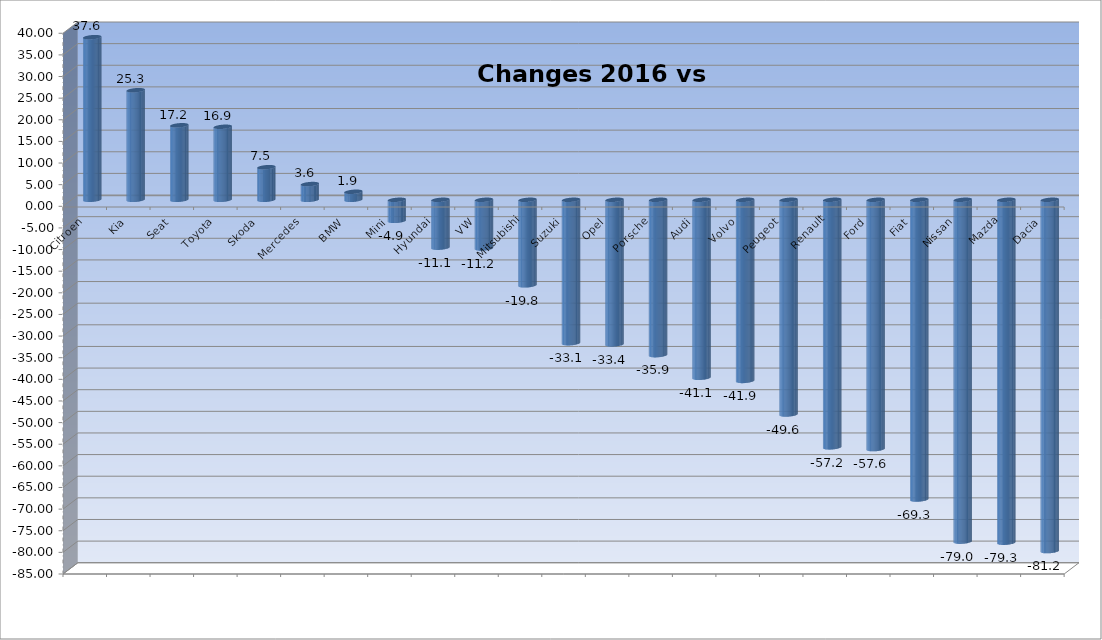
| Category | Ytd 2015 |
|---|---|
| Citroen | 37.594 |
| Kia | 25.331 |
| Seat | 17.226 |
| Toyota | 16.877 |
| Skoda | 7.537 |
| Mercedes | 3.636 |
| BMW | 1.855 |
| Mini | -4.863 |
| Hyundai | -11.07 |
| VW | -11.248 |
| Mitsubishi | -19.771 |
| Suzuki | -33.144 |
| Opel | -33.434 |
| Porsche | -35.915 |
| Audi | -41.139 |
| Volvo | -41.867 |
| Peugeot | -49.633 |
| Renault | -57.232 |
| Ford | -57.625 |
| Fiat | -69.29 |
| Nissan | -79.026 |
| Mazda | -79.274 |
| Dacia | -81.212 |